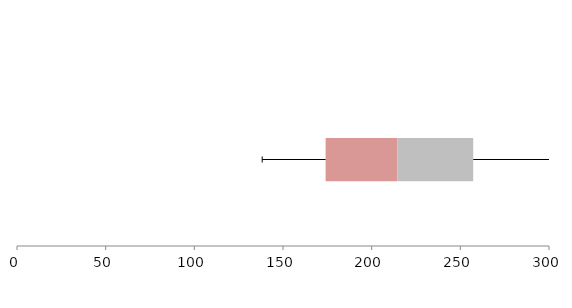
| Category | Series 1 | Series 2 | Series 3 |
|---|---|---|---|
| 0 | 174.032 | 40.508 | 42.72 |